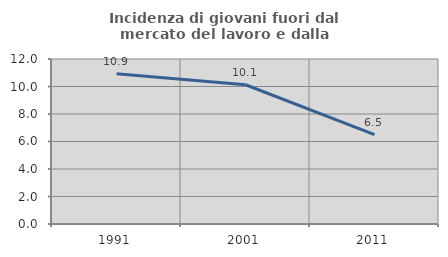
| Category | Incidenza di giovani fuori dal mercato del lavoro e dalla formazione  |
|---|---|
| 1991.0 | 10.924 |
| 2001.0 | 10.127 |
| 2011.0 | 6.494 |